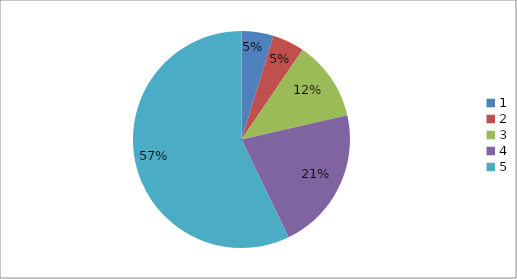
| Category | Series 0 |
|---|---|
| 0 | 0.048 |
| 1 | 0.048 |
| 2 | 0.119 |
| 3 | 0.214 |
| 4 | 0.571 |